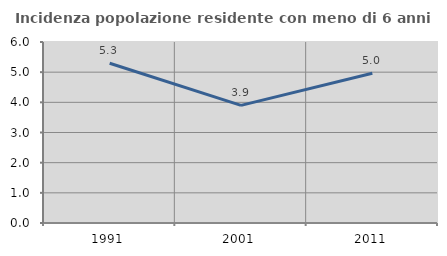
| Category | Incidenza popolazione residente con meno di 6 anni |
|---|---|
| 1991.0 | 5.297 |
| 2001.0 | 3.898 |
| 2011.0 | 4.963 |